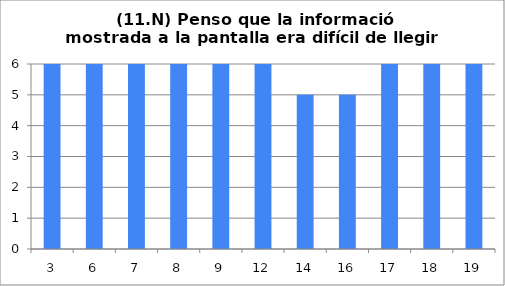
| Category | 11 |
|---|---|
| 3.0 | 6 |
| 6.0 | 6 |
| 7.0 | 6 |
| 8.0 | 6 |
| 9.0 | 6 |
| 12.0 | 6 |
| 14.0 | 5 |
| 16.0 | 5 |
| 17.0 | 6 |
| 18.0 | 6 |
| 19.0 | 6 |